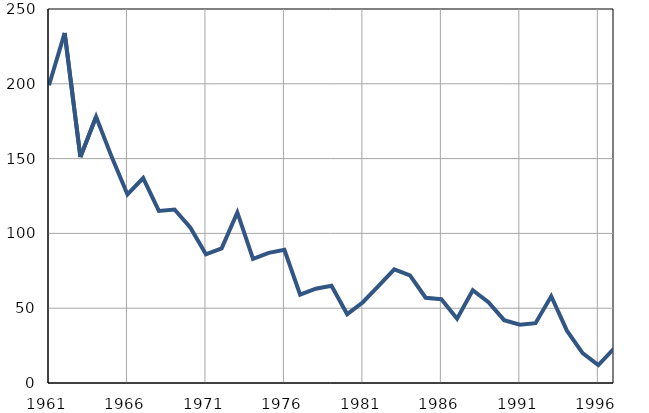
| Category | Умрла 
одојчад |
|---|---|
| 1961.0 | 199 |
| 1962.0 | 234 |
| 1963.0 | 151 |
| 1964.0 | 178 |
| 1965.0 | 151 |
| 1966.0 | 126 |
| 1967.0 | 137 |
| 1968.0 | 115 |
| 1969.0 | 116 |
| 1970.0 | 104 |
| 1971.0 | 86 |
| 1972.0 | 90 |
| 1973.0 | 114 |
| 1974.0 | 83 |
| 1975.0 | 87 |
| 1976.0 | 89 |
| 1977.0 | 59 |
| 1978.0 | 63 |
| 1979.0 | 65 |
| 1980.0 | 46 |
| 1981.0 | 54 |
| 1982.0 | 65 |
| 1983.0 | 76 |
| 1984.0 | 72 |
| 1985.0 | 57 |
| 1986.0 | 56 |
| 1987.0 | 43 |
| 1988.0 | 62 |
| 1989.0 | 54 |
| 1990.0 | 42 |
| 1991.0 | 39 |
| 1992.0 | 40 |
| 1993.0 | 58 |
| 1994.0 | 35 |
| 1995.0 | 20 |
| 1996.0 | 12 |
| 1997.0 | 23 |